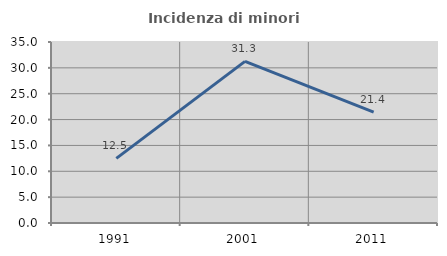
| Category | Incidenza di minori stranieri |
|---|---|
| 1991.0 | 12.5 |
| 2001.0 | 31.25 |
| 2011.0 | 21.429 |